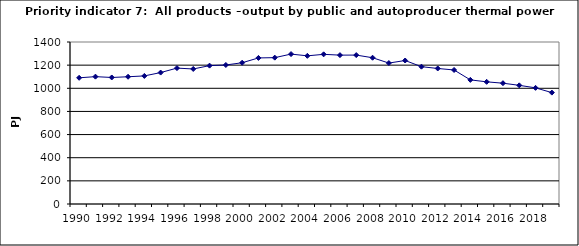
| Category | All products –output by public and autoproducer thermal power stations, PJ |
|---|---|
| 1990 | 1090.57 |
| 1991 | 1100.534 |
| 1992 | 1093.374 |
| 1993 | 1099.559 |
| 1994 | 1106.914 |
| 1995 | 1135.836 |
| 1996 | 1174.446 |
| 1997 | 1166.879 |
| 1998 | 1195.704 |
| 1999 | 1201.342 |
| 2000 | 1220.72 |
| 2001 | 1262.286 |
| 2002 | 1264.831 |
| 2003 | 1295.519 |
| 2004 | 1280.393 |
| 2005 | 1293.417 |
| 2006 | 1286.566 |
| 2007 | 1286.849 |
| 2008 | 1264.14 |
| 2009 | 1217.972 |
| 2010 | 1240.045 |
| 2011 | 1186.68 |
| 2012 | 1171.169 |
| 2013 | 1158.187 |
| 2014 | 1072.578 |
| 2015 | 1055.705 |
| 2016 | 1043.943 |
| 2017 | 1025.54 |
| 2018 | 1003.794 |
| 2019 | 962.768 |